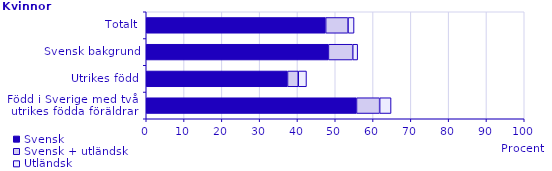
| Category | Svensk | Svensk + utländsk | Utländsk |
|---|---|---|---|
| Född i Sverige med två 
utrikes födda föräldrar | 55.621 | 6.124 | 3.02 |
| Utrikes född | 37.371 | 2.842 | 2.173 |
| Svensk bakgrund | 48.189 | 6.435 | 1.306 |
| Totalt | 47.46 | 5.923 | 1.589 |